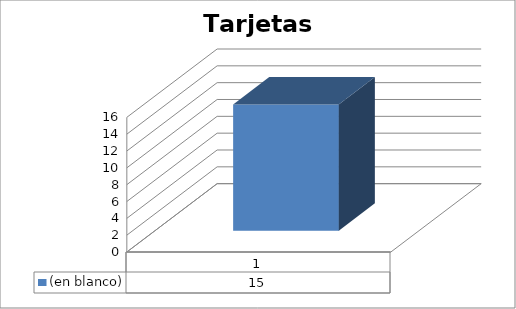
| Category | (en blanco) |
|---|---|
| 1 | 15 |